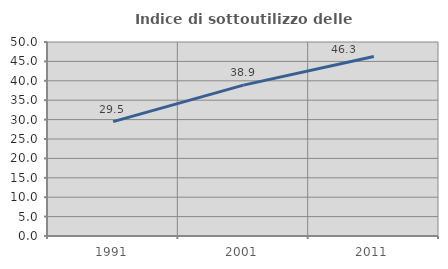
| Category | Indice di sottoutilizzo delle abitazioni  |
|---|---|
| 1991.0 | 29.481 |
| 2001.0 | 38.883 |
| 2011.0 | 46.251 |